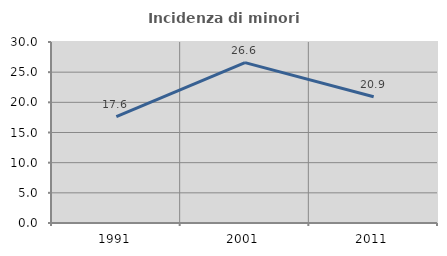
| Category | Incidenza di minori stranieri |
|---|---|
| 1991.0 | 17.647 |
| 2001.0 | 26.573 |
| 2011.0 | 20.921 |